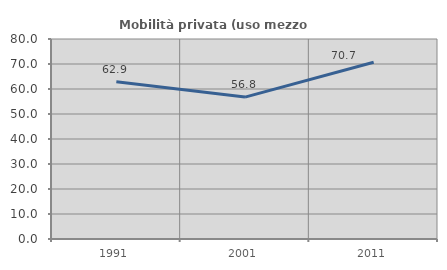
| Category | Mobilità privata (uso mezzo privato) |
|---|---|
| 1991.0 | 62.903 |
| 2001.0 | 56.757 |
| 2011.0 | 70.69 |